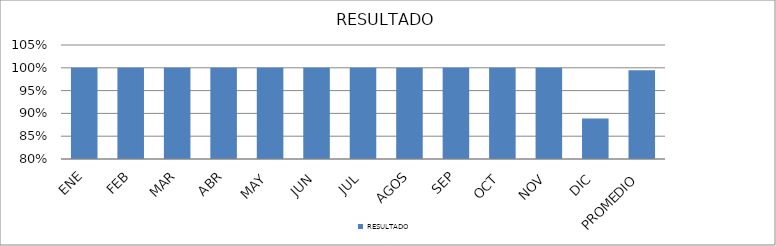
| Category | RESULTADO |
|---|---|
| ENE | 1 |
| FEB | 1 |
| MAR | 1 |
| ABR | 1 |
| MAY | 1 |
| JUN | 1 |
| JUL | 1 |
| AGOS | 1 |
| SEP | 1 |
| OCT | 1 |
| NOV | 1 |
| DIC | 0.889 |
| PROMEDIO | 0.994 |